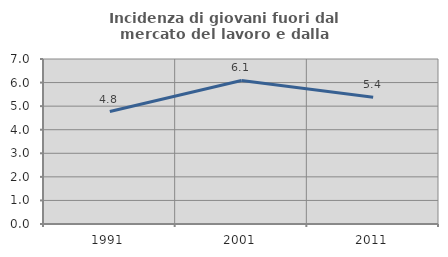
| Category | Incidenza di giovani fuori dal mercato del lavoro e dalla formazione  |
|---|---|
| 1991.0 | 4.771 |
| 2001.0 | 6.09 |
| 2011.0 | 5.375 |